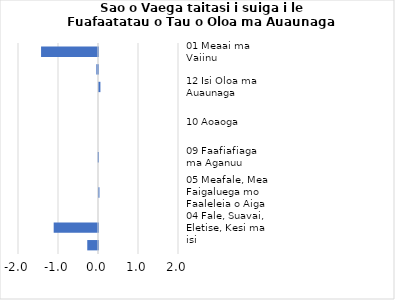
| Category |     Contributions |
|---|---|
| 01 Meaai ma Vaiinu | -1.423 |
| 02 Ava Malosi ma Tapaa | -0.042 |
| 12 Isi Oloa ma Auaunaga | 0.035 |
| 11 Faleaiga | 0 |
| 10 Aoaoga | 0 |
| 08 Fesootaiga | 0 |
| 09 Faafiafiaga ma Aganuu | -0.008 |
| 03 Lavalava ma Seevae | 0 |
| 05 Meafale, Mea Faigaluega mo Faaleleia o Aiga | 0.011 |
| 06 Soifua Maloloina | 0 |
| 04 Fale, Suavai, Eletise, Kesi ma isi | -1.108 |
| 07 Femalagaiga | -0.268 |